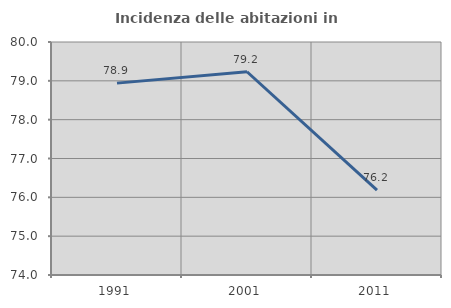
| Category | Incidenza delle abitazioni in proprietà  |
|---|---|
| 1991.0 | 78.941 |
| 2001.0 | 79.234 |
| 2011.0 | 76.185 |